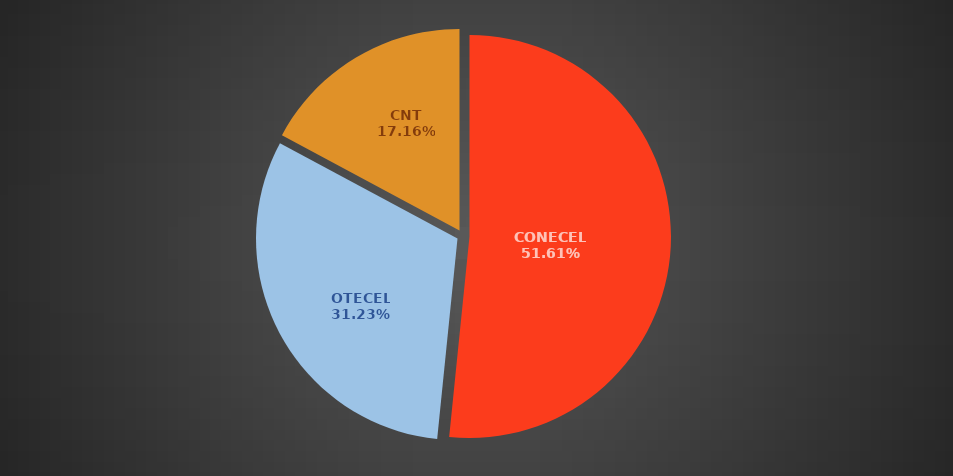
| Category | Jun 2022 |
|---|---|
| CONECEL | 8802391 |
| OTECEL | 5326606 |
| CNT | 2926942 |